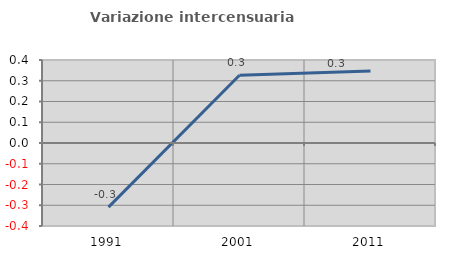
| Category | Variazione intercensuaria annua |
|---|---|
| 1991.0 | -0.309 |
| 2001.0 | 0.326 |
| 2011.0 | 0.347 |